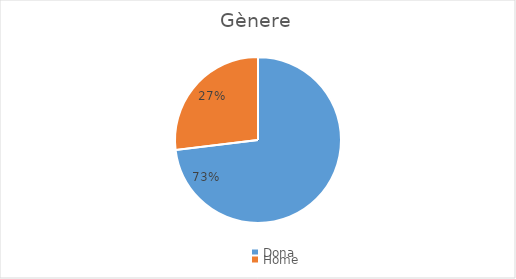
| Category | Series 0 |
|---|---|
| Dona | 19 |
| Home | 7 |